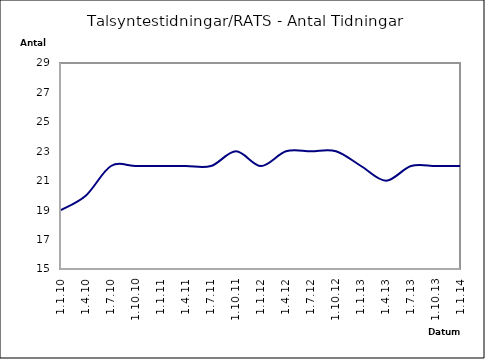
| Category | Series 0 |
|---|---|
| 1.1.10 | 19 |
| 1.4.10 | 20 |
| 1.7.10 | 22 |
| 1.10.10 | 22 |
| 1.1.11 | 22 |
| 1.4.11 | 22 |
| 1.7.11 | 22 |
| 1.10.11 | 23 |
| 1.1.12 | 22 |
| 1.4.12 | 23 |
| 1.7.12 | 23 |
| 1.10.12 | 23 |
| 1.1.13 | 22 |
| 1.4.13 | 21 |
| 1.7.13 | 22 |
| 1.10.13 | 22 |
| 1.1.14 | 22 |